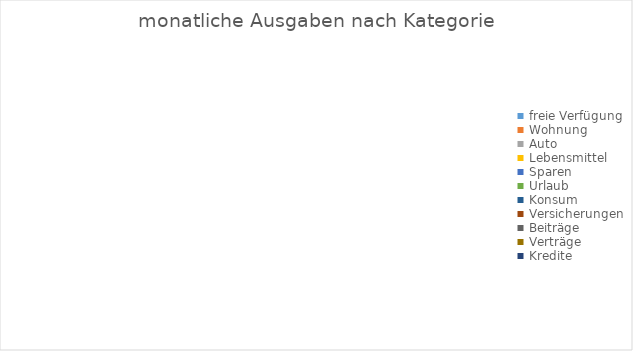
| Category | Series 0 |
|---|---|
| freie Verfügung | 0 |
| Wohnung | 0 |
| Auto | 0 |
| Lebensmittel | 0 |
| Sparen | 0 |
| Urlaub | 0 |
| Konsum | 0 |
| Versicherungen | 0 |
| Beiträge | 0 |
| Verträge | 0 |
| Kredite | 0 |